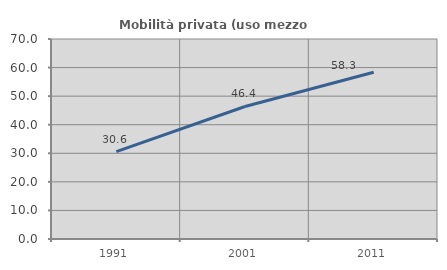
| Category | Mobilità privata (uso mezzo privato) |
|---|---|
| 1991.0 | 30.558 |
| 2001.0 | 46.384 |
| 2011.0 | 58.338 |